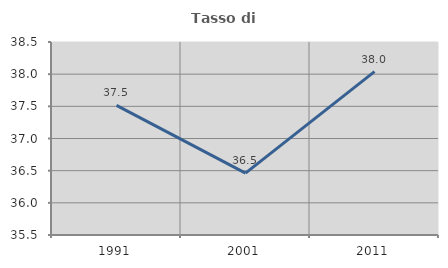
| Category | Tasso di occupazione   |
|---|---|
| 1991.0 | 37.515 |
| 2001.0 | 36.462 |
| 2011.0 | 38.039 |